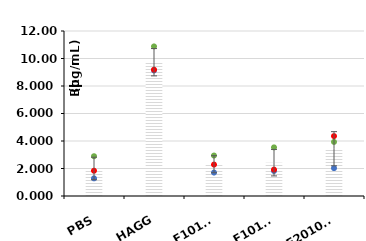
| Category | Series 0 |
|---|---|
| PBS | 2.003 |
| HAGG | 9.73 |
| F10102 | 2.312 |
| F10103 | 2.424 |
| F20104A | 3.438 |